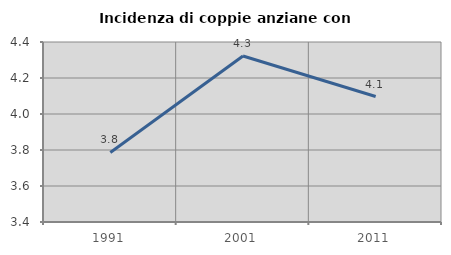
| Category | Incidenza di coppie anziane con figli |
|---|---|
| 1991.0 | 3.787 |
| 2001.0 | 4.323 |
| 2011.0 | 4.097 |